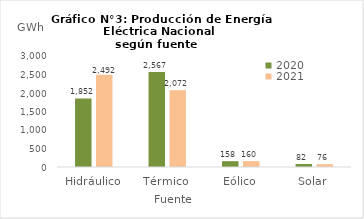
| Category | 2020 | 2021 |
|---|---|---|
| Hidráulico | 1851.763 | 2491.961 |
| Térmico | 2566.759 | 2071.641 |
| Eólico | 157.524 | 159.688 |
| Solar | 81.518 | 76.366 |